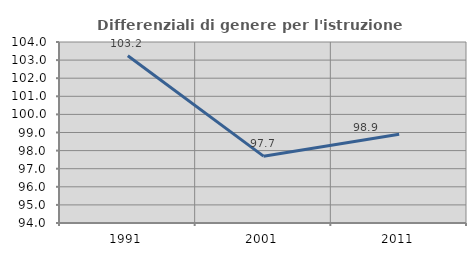
| Category | Differenziali di genere per l'istruzione superiore |
|---|---|
| 1991.0 | 103.237 |
| 2001.0 | 97.693 |
| 2011.0 | 98.906 |